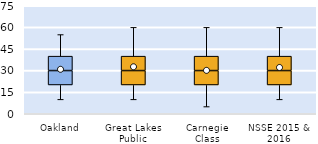
| Category | 25th | 50th | 75th |
|---|---|---|---|
| Oakland | 20 | 10 | 10 |
| Great Lakes Public | 20 | 10 | 10 |
| Carnegie Class | 20 | 10 | 10 |
| NSSE 2015 & 2016 | 20 | 10 | 10 |